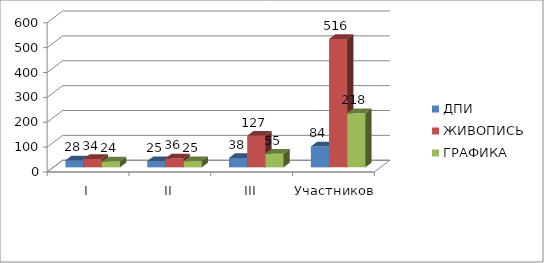
| Category | ДПИ | ЖИВОПИСЬ | ГРАФИКА |
|---|---|---|---|
| I | 28 | 34 | 24 |
| II | 25 | 36 | 25 |
| III | 38 | 127 | 55 |
| Участников | 84 | 516 | 218 |